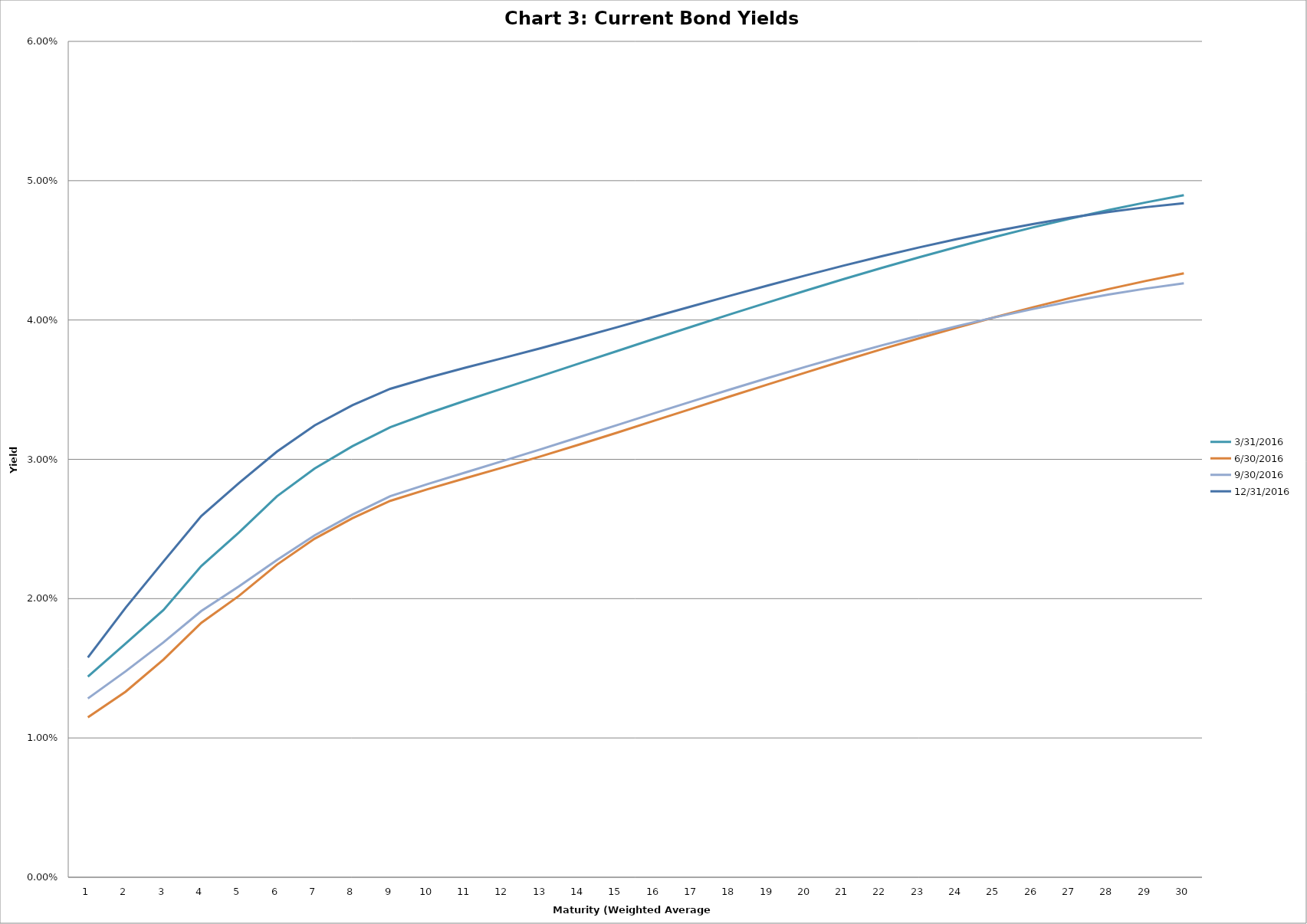
| Category | 3/31/2016 | 6/30/2016 | 9/30/2016 | 12/31/2016 |
|---|---|---|---|---|
| 0 | 0.014 | 0.011 | 0.013 | 0.016 |
| 1 | 0.017 | 0.013 | 0.015 | 0.019 |
| 2 | 0.019 | 0.016 | 0.017 | 0.023 |
| 3 | 0.022 | 0.018 | 0.019 | 0.026 |
| 4 | 0.025 | 0.02 | 0.021 | 0.028 |
| 5 | 0.027 | 0.022 | 0.023 | 0.031 |
| 6 | 0.029 | 0.024 | 0.025 | 0.032 |
| 7 | 0.031 | 0.026 | 0.026 | 0.034 |
| 8 | 0.032 | 0.027 | 0.027 | 0.035 |
| 9 | 0.033 | 0.028 | 0.028 | 0.036 |
| 10 | 0.034 | 0.029 | 0.029 | 0.037 |
| 11 | 0.035 | 0.029 | 0.03 | 0.037 |
| 12 | 0.036 | 0.03 | 0.031 | 0.038 |
| 13 | 0.037 | 0.031 | 0.032 | 0.039 |
| 14 | 0.038 | 0.032 | 0.032 | 0.039 |
| 15 | 0.039 | 0.033 | 0.033 | 0.04 |
| 16 | 0.04 | 0.034 | 0.034 | 0.041 |
| 17 | 0.04 | 0.035 | 0.035 | 0.042 |
| 18 | 0.041 | 0.035 | 0.036 | 0.042 |
| 19 | 0.042 | 0.036 | 0.037 | 0.043 |
| 20 | 0.043 | 0.037 | 0.037 | 0.044 |
| 21 | 0.044 | 0.038 | 0.038 | 0.045 |
| 22 | 0.045 | 0.039 | 0.039 | 0.045 |
| 23 | 0.045 | 0.039 | 0.04 | 0.046 |
| 24 | 0.046 | 0.04 | 0.04 | 0.046 |
| 25 | 0.047 | 0.041 | 0.041 | 0.047 |
| 26 | 0.047 | 0.042 | 0.041 | 0.047 |
| 27 | 0.048 | 0.042 | 0.042 | 0.048 |
| 28 | 0.048 | 0.043 | 0.042 | 0.048 |
| 29 | 0.049 | 0.043 | 0.043 | 0.048 |